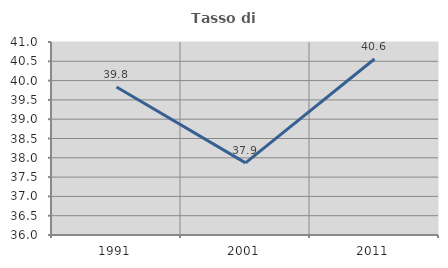
| Category | Tasso di occupazione   |
|---|---|
| 1991.0 | 39.832 |
| 2001.0 | 37.869 |
| 2011.0 | 40.559 |